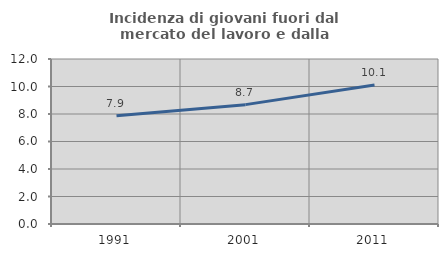
| Category | Incidenza di giovani fuori dal mercato del lavoro e dalla formazione  |
|---|---|
| 1991.0 | 7.877 |
| 2001.0 | 8.681 |
| 2011.0 | 10.116 |